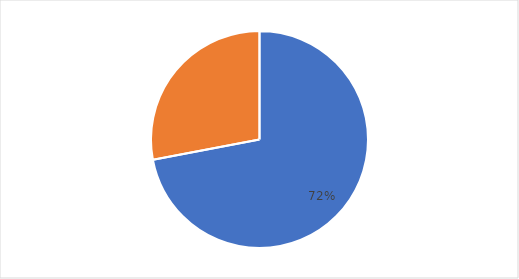
| Category | Series 0 |
|---|---|
| 0 | 0.72 |
| 1 | 0.28 |